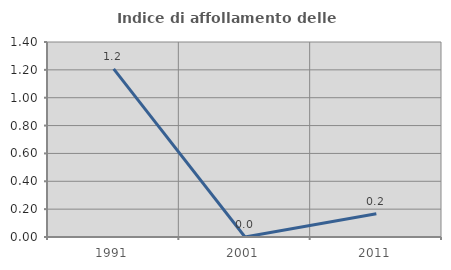
| Category | Indice di affollamento delle abitazioni  |
|---|---|
| 1991.0 | 1.207 |
| 2001.0 | 0 |
| 2011.0 | 0.166 |